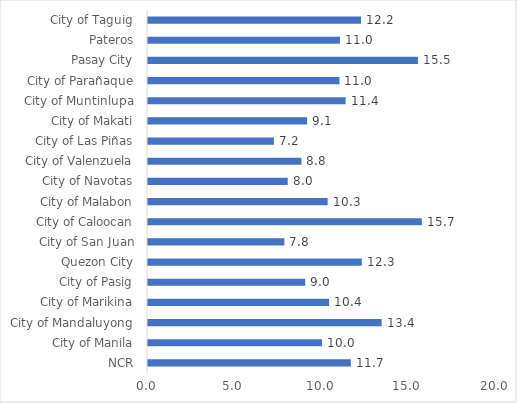
| Category | Series 0 |
|---|---|
| NCR | 11.657 |
| City of Manila | 10.006 |
| City of Mandaluyong | 13.426 |
| City of Marikina | 10.405 |
| City of Pasig | 9.037 |
| Quezon City | 12.286 |
| City of San Juan | 7.837 |
| City of Caloocan | 15.738 |
| City of Malabon | 10.326 |
| City of Navotas | 8.031 |
| City of Valenzuela | 8.819 |
| City of Las Piñas | 7.235 |
| City of Makati | 9.145 |
| City of Muntinlupa | 11.356 |
| City of Parañaque | 11.005 |
| Pasay City | 15.514 |
| Pateros | 11.031 |
| City of Taguig | 12.245 |